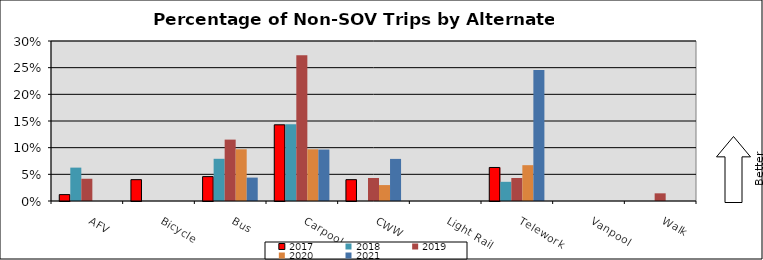
| Category | 2017 | 2018 | 2019 | 2020 | 2021 |
|---|---|---|---|---|---|
| AFV | 0.012 | 0.063 | 0.042 | 0 | 0 |
| Bicycle | 0.04 | 0 | 0 | 0 | 0 |
| Bus | 0.046 | 0.079 | 0.115 | 0.097 | 0.044 |
| Carpool | 0.143 | 0.144 | 0.273 | 0.097 | 0.096 |
| CWW | 0.04 | 0 | 0.043 | 0.03 | 0.079 |
| Light Rail | 0 | 0 | 0 | 0 | 0 |
| Telework | 0.063 | 0.036 | 0.043 | 0.067 | 0.246 |
| Vanpool | 0 | 0 | 0 | 0 | 0 |
| Walk | 0 | 0 | 0.014 | 0 | 0 |